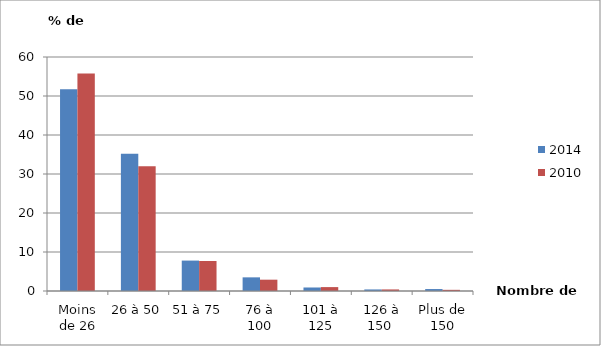
| Category | 2014 | 2010 |
|---|---|---|
| Moins de 26 | 51.7 | 55.8 |
| 26 à 50 | 35.2 | 32 |
| 51 à 75 | 7.8 | 7.7 |
| 76 à 100 | 3.5 | 2.9 |
| 101 à 125 | 0.9 | 1 |
| 126 à 150  | 0.4 | 0.4 |
| Plus de 150 | 0.5 | 0.3 |